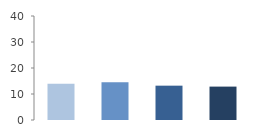
| Category | Rate (%) |
|---|---|
| 2009.0 | 13.904 |
| 2010.0 | 14.553 |
| 2011.0 | 13.207 |
| 2012.0 | 12.845 |